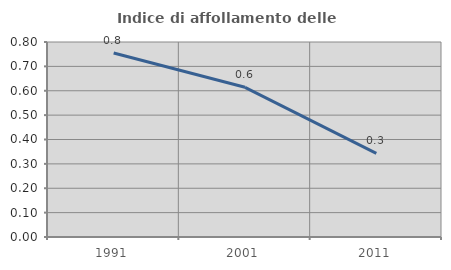
| Category | Indice di affollamento delle abitazioni  |
|---|---|
| 1991.0 | 0.755 |
| 2001.0 | 0.614 |
| 2011.0 | 0.343 |